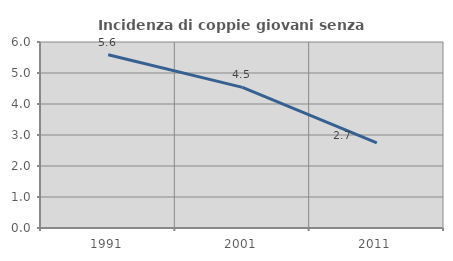
| Category | Incidenza di coppie giovani senza figli |
|---|---|
| 1991.0 | 5.59 |
| 2001.0 | 4.535 |
| 2011.0 | 2.748 |